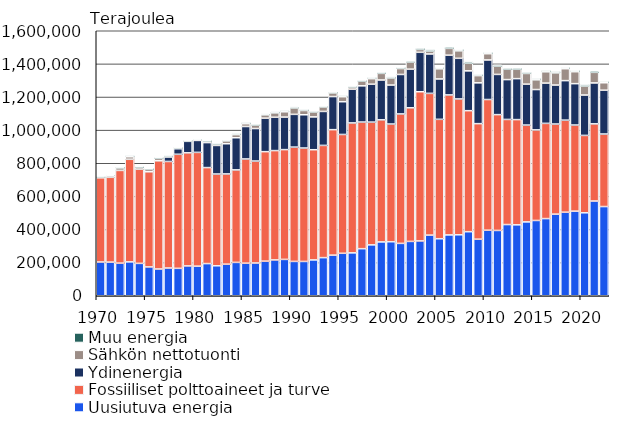
| Category | Uusiutuva energia | Fossiiliset polttoaineet ja turve | Ydinenergia | Sähkön nettotuonti | Muu energia |
|---|---|---|---|---|---|
| 1970 | 204034 | 508504 | 0 | 1901 | 6019 |
| 1971 | 203391 | 511718 | 0 | 9324 | 5332 |
| 1972 | 196893 | 559888 | 0 | 15188 | 6235 |
| 1973 | 204727 | 619154 | 0 | 15548 | 6710 |
| 1974 | 195495 | 568746 | 0 | 11304 | 6376 |
| 1975 | 174262 | 574160 | 0 | 14353 | 7009 |
| 1976 | 161759 | 652963 | 0 | 14454 | 6905 |
| 1977 | 167731 | 643076 | 27382 | 3208 | 5018 |
| 1978 | 165642 | 688482 | 33589 | 4597 | 3762 |
| 1979 | 180305 | 682582 | 69382 | 2336 | 4806 |
| 1980 | 178903 | 686739 | 72273 | 4360 | 4590 |
| 1981 | 194307 | 579548 | 150927 | 8078 | 5724 |
| 1982 | 181119 | 553807 | 172647 | 8330 | 6156 |
| 1983 | 190664 | 544813 | 182367 | 17201 | 6354 |
| 1984 | 201454 | 558455 | 194171 | 18774 | 6646 |
| 1985 | 196619 | 629150 | 196145 | 17017 | 6908 |
| 1986 | 197924 | 615426 | 196342 | 20905 | 6811 |
| 1987 | 208971 | 661019 | 202189 | 20142 | 6779 |
| 1988 | 216562 | 659887 | 201240 | 26586 | 7196 |
| 1989 | 219571 | 662704 | 196473 | 31925 | 7398 |
| 1990 | 207422 | 690098 | 197760 | 38671 | 7405 |
| 1991 | 207239 | 684720 | 200804 | 25862 | 6091 |
| 1992 | 216629 | 665041 | 198218 | 29632 | 6872 |
| 1993 | 230190 | 677551 | 205091 | 27133 | 6159 |
| 1994 | 245453 | 757326 | 199942 | 21881 | 6551 |
| 1995 | 256458 | 717360 | 197760 | 30258 | 6784 |
| 1996 | 259208 | 784276 | 203771 | 13180 | 6194 |
| 1997 | 284274 | 764448 | 218738 | 27551 | 7069 |
| 1998 | 307479 | 740875 | 228829 | 33502 | 7822 |
| 1999 | 325310 | 736677 | 240655 | 40046 | 7520 |
| 2000 | 326231 | 710532 | 235364 | 42768 | 7678 |
| 2001 | 316275 | 781430 | 238406 | 35852 | 7762 |
| 2002 | 328174 | 806541 | 233398 | 42930 | 7996 |
| 2003 | 331314 | 900452 | 238145 | 17467 | 8328 |
| 2004 | 366403 | 855530 | 237970 | 17532 | 8783 |
| 2005 | 344430 | 720697 | 243887 | 61250 | 9285 |
| 2006 | 367566 | 844939 | 240040 | 41044 | 9203 |
| 2007 | 368289 | 819840 | 245468 | 45205 | 9404 |
| 2008 | 386825 | 730554 | 240542 | 45980 | 9273 |
| 2009 | 341532 | 697567 | 246555 | 43504 | 7137 |
| 2010 | 395818 | 788983 | 238789 | 37802 | 8506 |
| 2011 | 394362 | 699146 | 242897 | 49863 | 7837 |
| 2012 | 429960 | 634540 | 240685 | 62796 | 7614 |
| 2013 | 428416 | 635098 | 247347 | 56574 | 8308 |
| 2014 | 446145 | 584371 | 247047 | 64678 | 8372 |
| 2015 | 454640 | 546856 | 243556 | 58813 | 8264 |
| 2016 | 465983 | 574833 | 243056 | 68222 | 8246 |
| 2017 | 492970 | 543915 | 235352 | 73532 | 8287 |
| 2018 | 504503 | 555693 | 238700 | 71769 | 8512 |
| 2019 | 511004 | 519670 | 249981 | 72151 | 8227 |
| 2020 | 501069 | 467029 | 243864 | 54377 | 9391 |
| 2021 | 572222 | 465643 | 247047 | 63965 | 9295 |
| 2022 | 538598 | 437906 | 264458 | 45063 | 8212 |